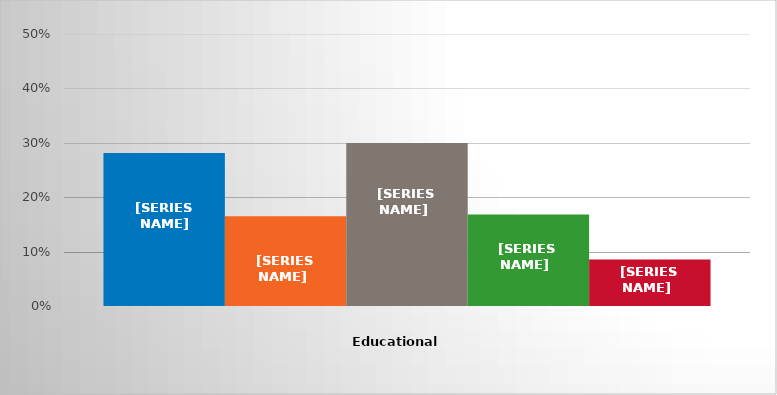
| Category | GED/High school diploma | Less than 1 year of college | 1 year of college | 2 years of college | Other |
|---|---|---|---|---|---|
| 0 | 0.281 | 0.165 | 0.3 | 0.168 | 0.086 |